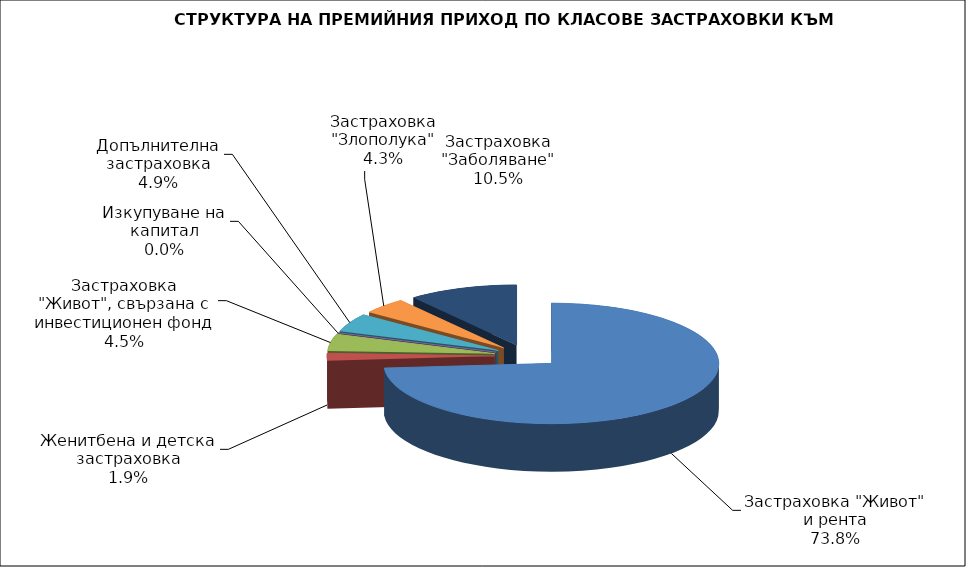
| Category | Series 0 |
|---|---|
| Застраховка "Живот" и рента | 58372708.434 |
| Женитбена и детска застраховка | 1540877.923 |
| Застраховка "Живот", свързана с инвестиционен фонд | 3583215.44 |
| Изкупуване на капитал | 0 |
| Допълнителна застраховка | 3869951.169 |
| Застраховка "Злополука" | 3428611.82 |
| Застраховка "Заболяване" | 8347215.39 |